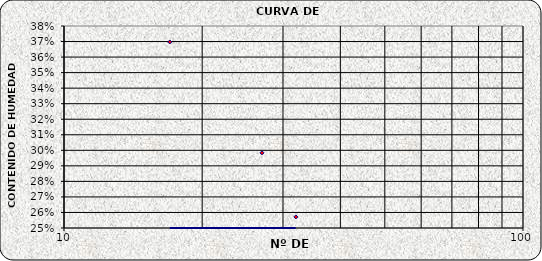
| Category | Series 0 |
|---|---|
| 32.0 | 0.257 |
| 27.0 | 0.298 |
| 17.0 | 0.37 |